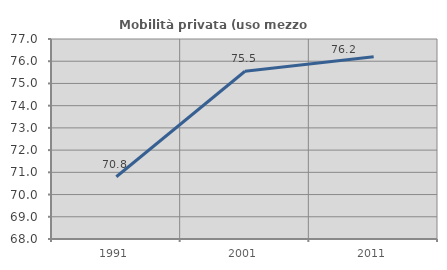
| Category | Mobilità privata (uso mezzo privato) |
|---|---|
| 1991.0 | 70.8 |
| 2001.0 | 75.548 |
| 2011.0 | 76.199 |